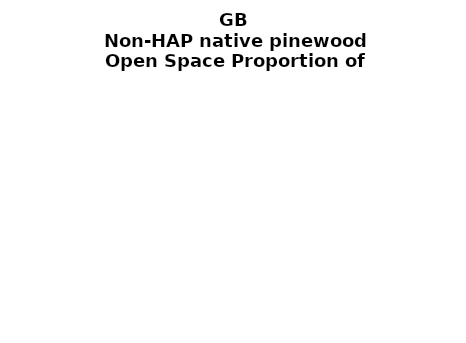
| Category | Non-HAP native pinewood |
|---|---|
|  ≥ 10ha, < 10%  | 0.549 |
|   ≥ 10ha, 10-25% | 0.138 |
|   ≥ 10ha, > 25 and <50%  | 0.123 |
|   ≥ 10ha, ≥ 50%  | 0.148 |
|  < 10ha, < 10% | 0 |
|  < 10ha, 10-25% | 0 |
|  < 10ha, > 25 and < 50% | 0.016 |
|  < 10ha, ≥ 50% | 0.028 |